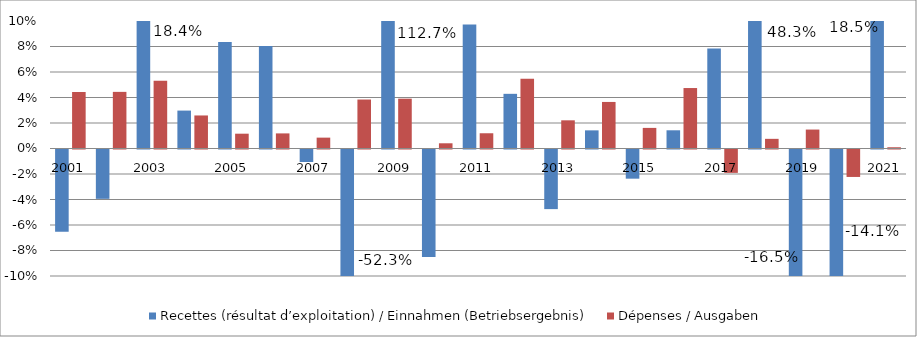
| Category | Recettes (résultat d’exploitation) / Einnahmen (Betriebsergebnis) | Dépenses / Ausgaben |
|---|---|---|
| 2001.0 | -0.065 | 0.044 |
| 2002.0 | -0.039 | 0.044 |
| 2003.0 | 0.184 | 0.053 |
| 2004.0 | 0.03 | 0.026 |
| 2005.0 | 0.084 | 0.012 |
| 2006.0 | 0.08 | 0.012 |
| 2007.0 | -0.01 | 0.009 |
| 2008.0 | -0.523 | 0.038 |
| 2009.0 | 1.127 | 0.039 |
| 2010.0 | -0.084 | 0.004 |
| 2011.0 | 0.097 | 0.012 |
| 2012.0 | 0.043 | 0.055 |
| 2013.0 | -0.047 | 0.022 |
| 2014.0 | 0.014 | 0.037 |
| 2015.0 | -0.023 | 0.016 |
| 2016.0 | 0.014 | 0.047 |
| 2017.0 | 0.078 | -0.018 |
| 2018.0 | 0.483 | 0.008 |
| 2019.0 | -0.165 | 0.015 |
| 2020.0 | -0.141 | -0.022 |
| 2021.0 | 0.185 | 0.001 |